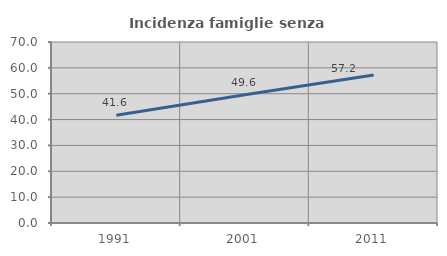
| Category | Incidenza famiglie senza nuclei |
|---|---|
| 1991.0 | 41.633 |
| 2001.0 | 49.583 |
| 2011.0 | 57.198 |